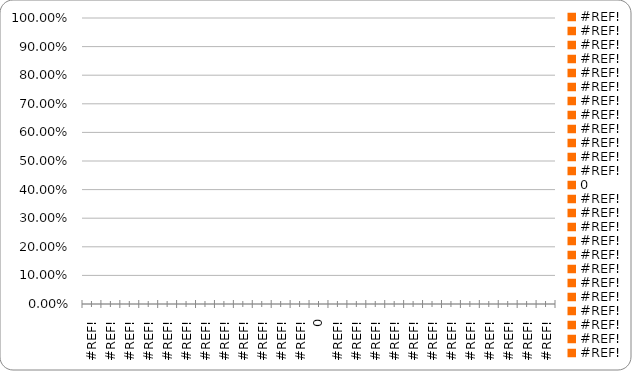
| Category | % |
|---|---|
| 0.0 | 0 |
| 0.0 | 0 |
| 0.0 | 0 |
| 0.0 | 0 |
| 0.0 | 0 |
| 0.0 | 0 |
| 0.0 | 0 |
| 0.0 | 0 |
| 0.0 | 0 |
| 0.0 | 0 |
| 0.0 | 0 |
| 0.0 | 0 |
| 0.0 | 0 |
| 0.0 | 0 |
| 0.0 | 0 |
| 0.0 | 0 |
| 0.0 | 0 |
| 0.0 | 0 |
| 0.0 | 0 |
| 0.0 | 0 |
| 0.0 | 0 |
| 0.0 | 0 |
| 0.0 | 0 |
| 0.0 | 0 |
| 0.0 | 0 |